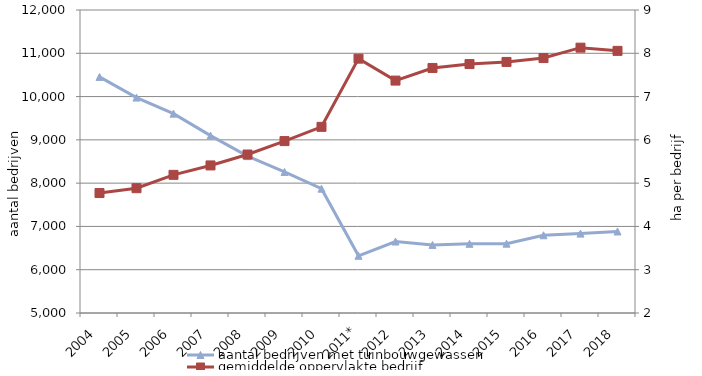
| Category | aantal bedrijven met tuinbouwgewassen |
|---|---|
| 2004 | 10454 |
| 2005 | 9977 |
| 2006 | 9606 |
| 2007 | 9098 |
| 2008 | 8624 |
| 2009 | 8259 |
| 2010 | 7872 |
| 2011* | 6322 |
| 2012 | 6651 |
| 2013 | 6573 |
| 2014 | 6599 |
| 2015 | 6602 |
| 2016 | 6796 |
| 2017 | 6834 |
| 2018 | 6883 |